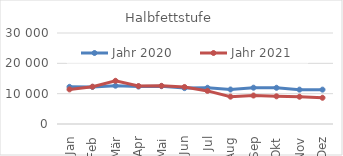
| Category | Jahr 2020 | Jahr 2021 |
|---|---|---|
| 0 | 12252.343 | 11408.906 |
| 1 | 12229.648 | 12307.318 |
| 2 | 12626.218 | 14242.018 |
| 3 | 12351.462 | 12504.491 |
| 4 | 12469.26 | 12585.84 |
| 5 | 11827.424 | 12206.75 |
| 6 | 11941.71 | 10912.542 |
| 7 | 11374.316 | 9015.687 |
| 8 | 11969.588 | 9388.99 |
| 9 | 11942.924 | 9127.209 |
| 10 | 11328.879 | 8985.363 |
| 11 | 11326.972 | 8651.042 |